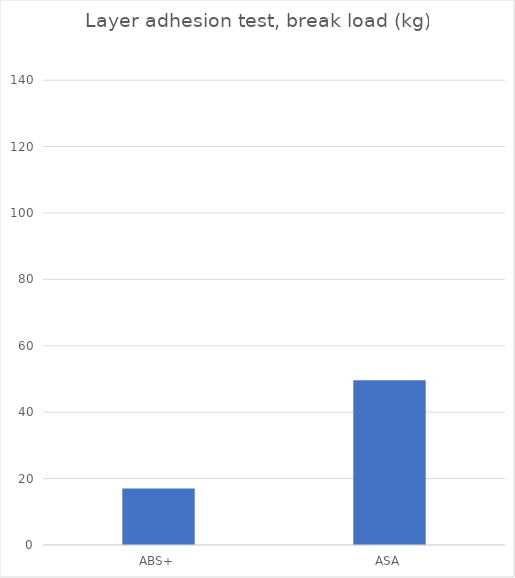
| Category | Average |
|---|---|
| ABS+ | 17 |
| ASA | 49.6 |